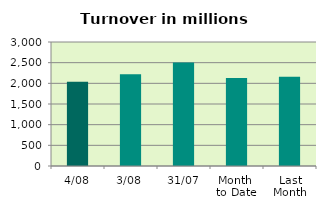
| Category | Series 0 |
|---|---|
| 4/08 | 2038.843 |
| 3/08 | 2218.407 |
| 31/07 | 2502.556 |
| Month 
to Date | 2128.625 |
| Last
Month | 2162.227 |